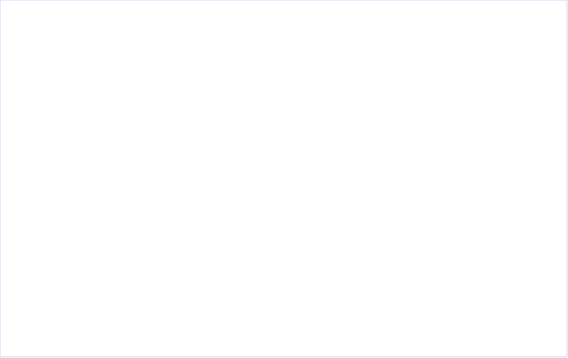
| Category | Total |
|---|---|
| 2019 | 2 |
| 2020 | 2.875 |
| 2021 | 2.75 |